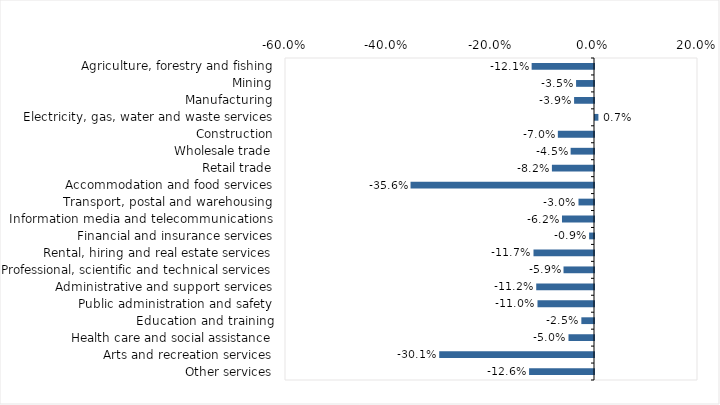
| Category | This week |
|---|---|
| Agriculture, forestry and fishing | -0.121 |
| Mining | -0.035 |
| Manufacturing | -0.039 |
| Electricity, gas, water and waste services | 0.007 |
| Construction | -0.07 |
| Wholesale trade | -0.045 |
| Retail trade | -0.082 |
| Accommodation and food services | -0.356 |
| Transport, postal and warehousing | -0.03 |
| Information media and telecommunications | -0.062 |
| Financial and insurance services | -0.009 |
| Rental, hiring and real estate services | -0.117 |
| Professional, scientific and technical services | -0.059 |
| Administrative and support services | -0.112 |
| Public administration and safety | -0.11 |
| Education and training | -0.025 |
| Health care and social assistance | -0.05 |
| Arts and recreation services | -0.301 |
| Other services | -0.126 |